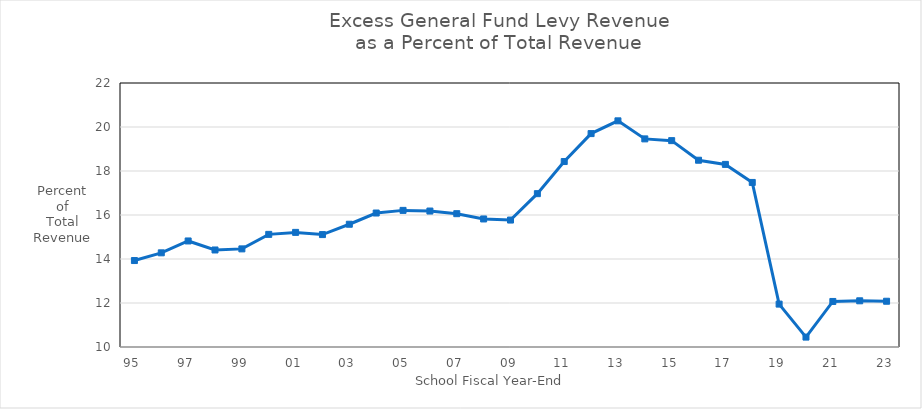
| Category | Percent |
|---|---|
| 95 | 13.93 |
| 96 | 14.28 |
| 97 | 14.82 |
| 98 | 14.41 |
| 99 | 14.46 |
| 00 | 15.12 |
| 01 | 15.21 |
| 02 | 15.11 |
| 03 | 15.58 |
| 04 | 16.09 |
| 05 | 16.21 |
| 06 | 16.18 |
| 07 | 16.06 |
| 08 | 15.82 |
| 09 | 15.77 |
| 10 | 16.97 |
| 11 | 18.43 |
| 12 | 19.7 |
| 13 | 20.28 |
| 14 | 19.46 |
| 15 | 19.38 |
| 16 | 18.49 |
| 17 | 18.3 |
| 18 | 17.48 |
| 19 | 11.95 |
| 20 | 10.45 |
| 21 | 12.07 |
| 22 | 12.1 |
| 23 | 12.08 |